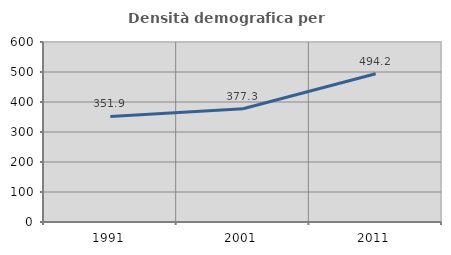
| Category | Densità demografica |
|---|---|
| 1991.0 | 351.895 |
| 2001.0 | 377.274 |
| 2011.0 | 494.201 |